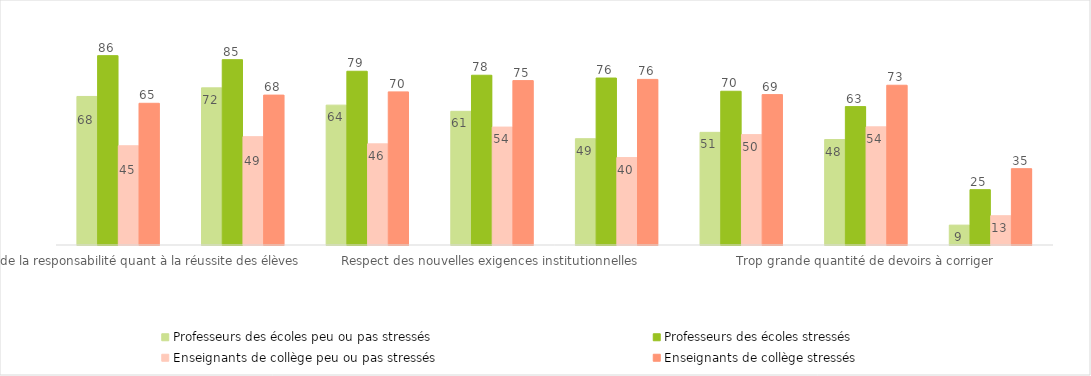
| Category | Professeurs des écoles | Enseignants de collège |
|---|---|---|
| Attribution de la responsabilité quant à la réussite des élèves | 86.461 | 64.706 |
| Adaptation des cours pour les élèves ayant des besoins éducatifs particuliers | 84.624 | 68.444 |
| Trop grande quantité de cours à préparer | 79.334 | 69.915 |
| Respect des nouvelles exigences institutionnelles | 77.516 | 75.06 |
| Maintien de la discipline | 76.24 | 75.618 |
| Trop grande quantité de travail administratif | 70.2 | 68.669 |
| Trop grande quantité de devoirs à corriger | 63.185 | 72.945 |
| Intimidations ou agressions verbales par les élèves | 25.276 | 34.85 |